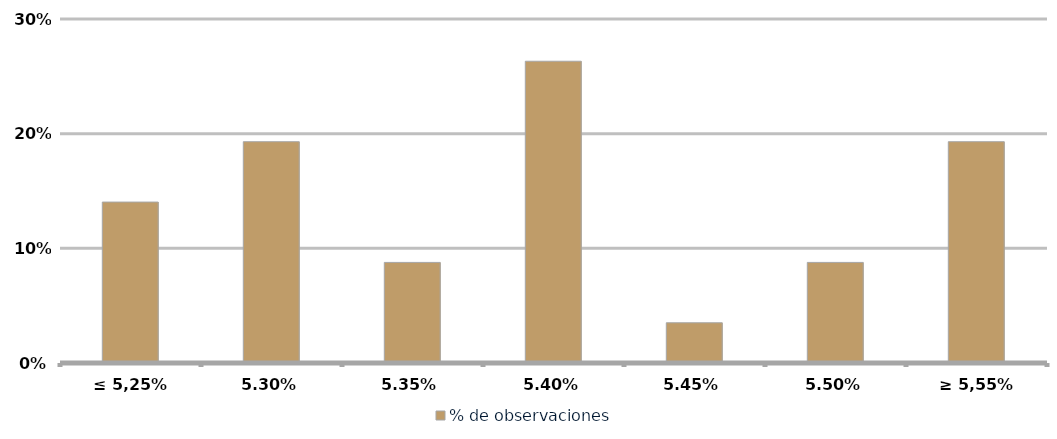
| Category | % de observaciones  |
|---|---|
| ≤ 5,25% | 0.14 |
| 5,30% | 0.193 |
| 5,35% | 0.088 |
| 5,40% | 0.263 |
| 5,45% | 0.035 |
| 5,50% | 0.088 |
| ≥ 5,55% | 0.193 |